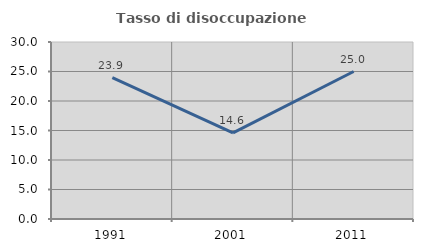
| Category | Tasso di disoccupazione giovanile  |
|---|---|
| 1991.0 | 23.944 |
| 2001.0 | 14.583 |
| 2011.0 | 25 |